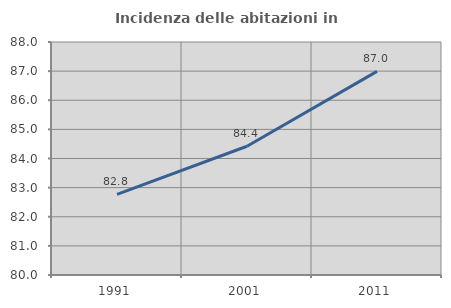
| Category | Incidenza delle abitazioni in proprietà  |
|---|---|
| 1991.0 | 82.766 |
| 2001.0 | 84.42 |
| 2011.0 | 86.993 |